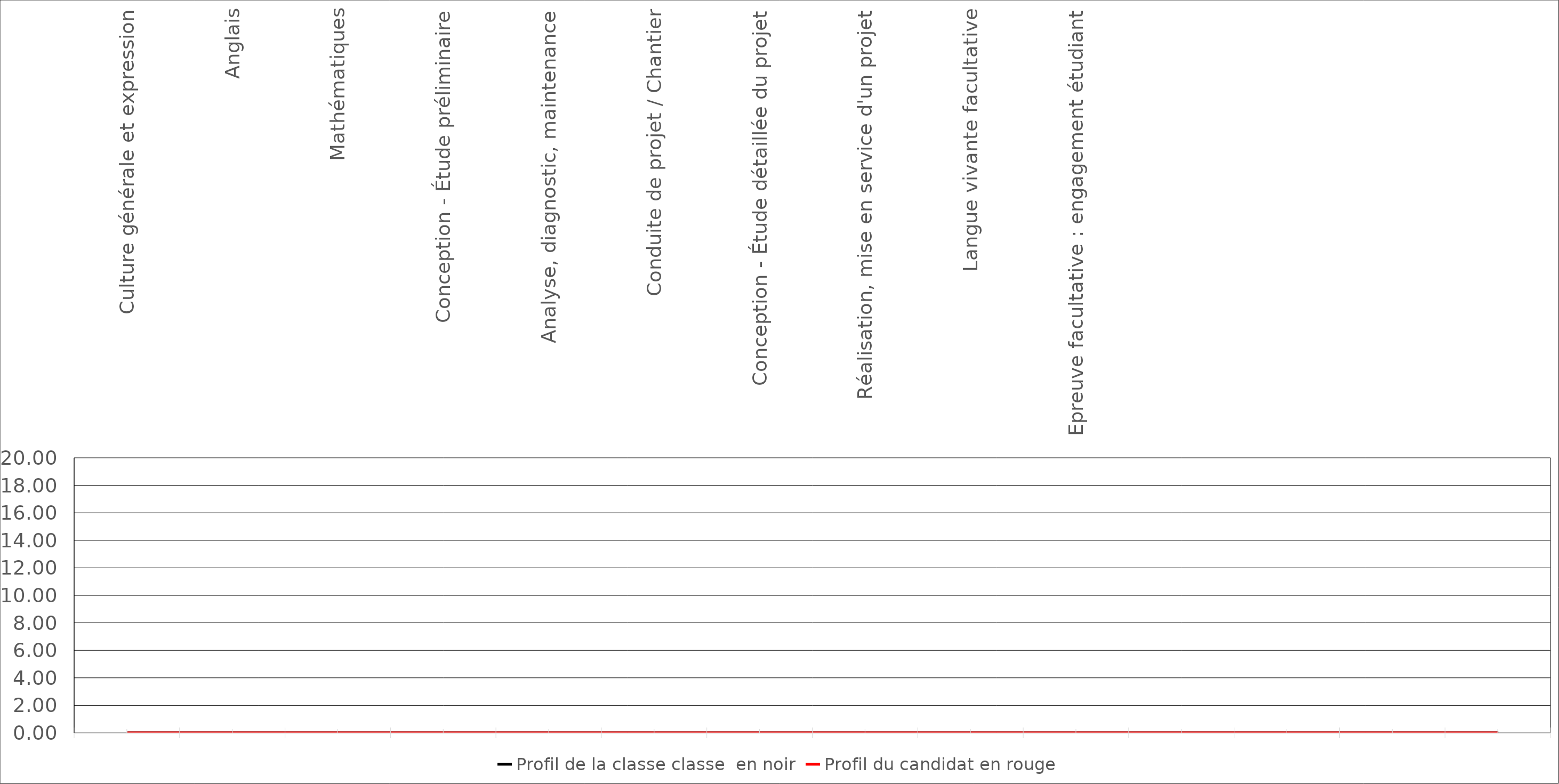
| Category | Profil de la classe classe  en noir | Profil du candidat en rouge |
|---|---|---|
| Culture générale et expression | 0 | 0 |
| Anglais | 0 | 0 |
| Mathématiques | 0 | 0 |
| Conception - Étude préliminaire | 0 | 0 |
| Analyse, diagnostic, maintenance | 0 | 0 |
| Conduite de projet / Chantier | 0 | 0 |
| Conception - Étude détaillée du projet | 0 | 0 |
| Réalisation, mise en service d'un projet | 0 | 0 |
| Langue vivante facultative | 0 | 0 |
| Epreuve facultative : engagement étudiant | 0 | 0 |